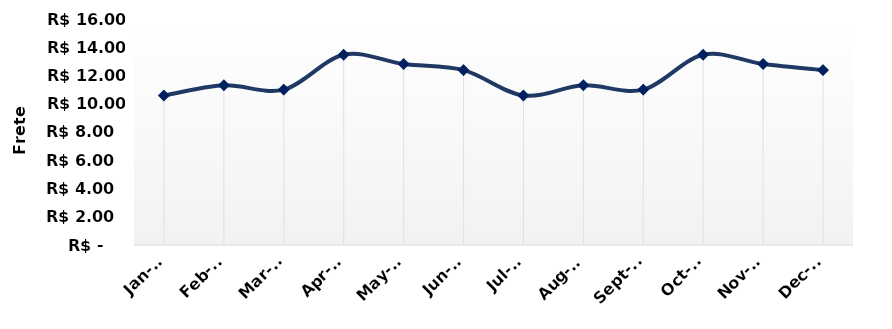
| Category | Frete Rodoviário (R$/t) |
|---|---|
| 2016-01-01 | 10.584 |
| 2016-02-01 | 11.304 |
| 2016-03-01 | 11.004 |
| 2016-04-01 | 13.469 |
| 2016-05-01 | 12.809 |
| 2016-06-01 | 12.379 |
| 2016-07-01 | 10.584 |
| 2016-08-01 | 11.304 |
| 2016-09-01 | 11.004 |
| 2016-10-01 | 13.469 |
| 2016-11-01 | 12.809 |
| 2016-12-01 | 12.379 |